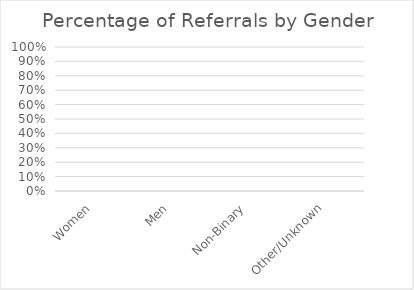
| Category | % of referred |
|---|---|
| Women | 0 |
| Men | 0 |
| Non-Binary | 0 |
| Other/Unknown | 0 |